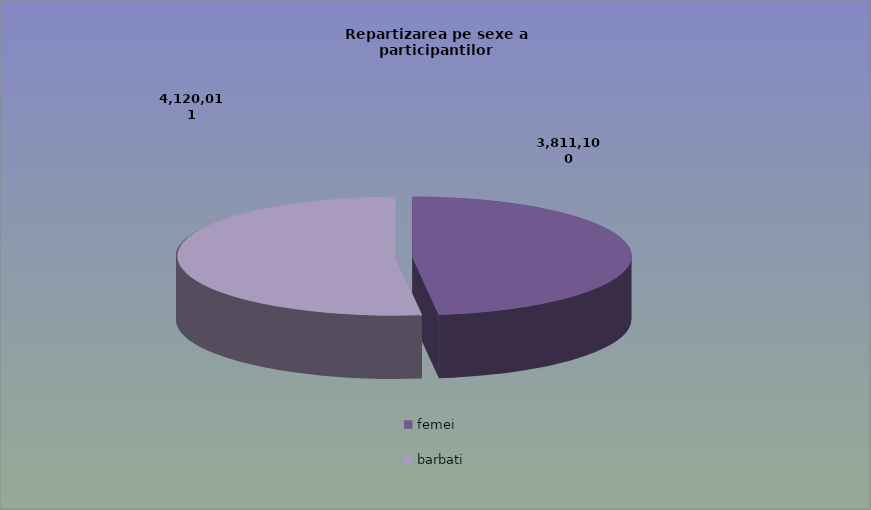
| Category | Series 0 |
|---|---|
| femei | 3811100 |
| barbati | 4120011 |